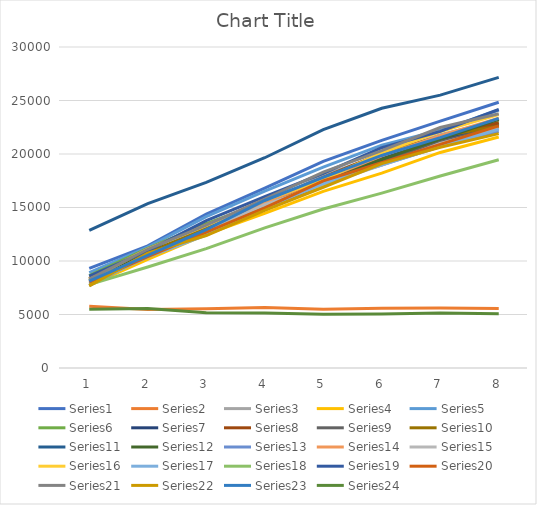
| Category | Series 0 | Series 1 | Series 2 | Series 3 | Series 4 | Series 5 | Series 6 | Series 7 | Series 8 | Series 9 | Series 10 | Series 11 | Series 12 | Series 13 | Series 14 | Series 15 | Series 16 | Series 17 | Series 18 | Series 19 | Series 20 | Series 21 | Series 22 | Series 23 |
|---|---|---|---|---|---|---|---|---|---|---|---|---|---|---|---|---|---|---|---|---|---|---|---|---|
| 0 | 9316 | 5761 | 8279 | 7730 | 8907 | 8636 | 8127 | 8383 | 8069 | 8298 | 12863 | 8159 | 7701 | 8299 | 8163 | 8331 | 7867 | 7787 | 8590 | 7994 | 8302 | 7675 | 8118 | 5495 |
| 1 | 11418 | 5469 | 10631 | 10140 | 11292 | 11180 | 10529 | 10921 | 10466 | 10812 | 15354 | 11011 | 10524 | 11113 | 10405 | 11095 | 10377 | 9434 | 10948 | 10414 | 11099 | 10731 | 10535 | 5553 |
| 2 | 14392 | 5548 | 13347 | 12481 | 14148 | 13499 | 12931 | 13340 | 12868 | 13165 | 17348 | 13356 | 12551 | 13353 | 12873 | 13315 | 12419 | 11158 | 13772 | 12707 | 13348 | 12379 | 12927 | 5160 |
| 3 | 16804 | 5646 | 15297 | 14448 | 16534 | 15511 | 14971 | 15523 | 14921 | 15274 | 19651 | 15485 | 14901 | 15454 | 15257 | 15670 | 14970 | 13092 | 16024 | 14961 | 15791 | 14723 | 15656 | 5142 |
| 4 | 19306 | 5480 | 18033 | 16513 | 18770 | 17652 | 17256 | 17820 | 17146 | 17777 | 22283 | 17695 | 17395 | 17630 | 17119 | 17574 | 17224 | 14858 | 18197 | 17483 | 18298 | 16893 | 17822 | 5012 |
| 5 | 21270 | 5577 | 19885 | 18209 | 20832 | 19577 | 19566 | 20062 | 19338 | 19959 | 24276 | 19483 | 18966 | 19821 | 18969 | 20120 | 18993 | 16346 | 20587 | 19185 | 20311 | 19107 | 19864 | 5042 |
| 6 | 23069 | 5608 | 21809 | 20146 | 22214 | 21082 | 21353 | 21640 | 21117 | 21634 | 25502 | 21388 | 20697 | 21718 | 20997 | 22091 | 20698 | 17938 | 22109 | 20902 | 22475 | 20629 | 21525 | 5147 |
| 7 | 24835 | 5567 | 23127 | 21590 | 24116 | 22918 | 22744 | 22913 | 22543 | 22622 | 27162 | 23233 | 22117 | 23357 | 22384 | 23685 | 22299 | 19465 | 24160 | 22631 | 23768 | 21906 | 23324 | 5078 |